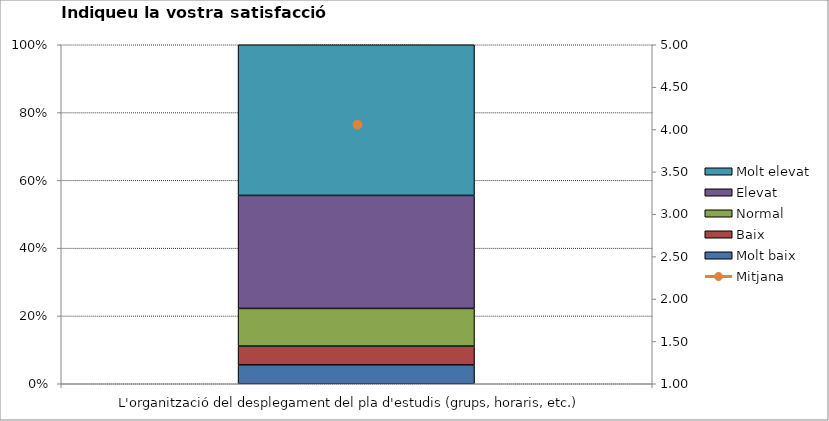
| Category | Molt baix | Baix | Normal  | Elevat | Molt elevat |
|---|---|---|---|---|---|
| L'organització del desplegament del pla d'estudis (grups, horaris, etc.) | 1 | 1 | 2 | 6 | 8 |